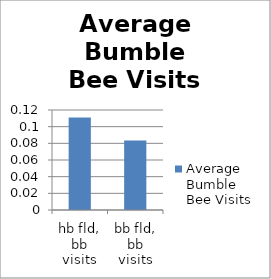
| Category | Average Bumble Bee Visits |
|---|---|
| hb fld, bb visits | 0.111 |
| bb fld, bb visits | 0.083 |